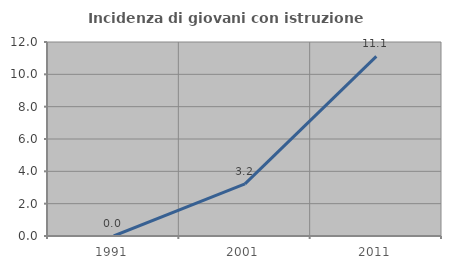
| Category | Incidenza di giovani con istruzione universitaria |
|---|---|
| 1991.0 | 0 |
| 2001.0 | 3.226 |
| 2011.0 | 11.111 |